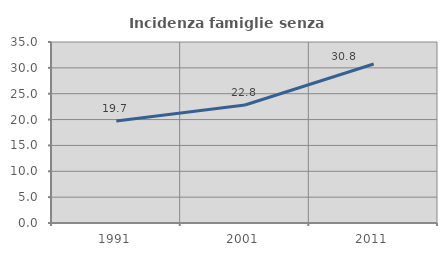
| Category | Incidenza famiglie senza nuclei |
|---|---|
| 1991.0 | 19.704 |
| 2001.0 | 22.824 |
| 2011.0 | 30.751 |